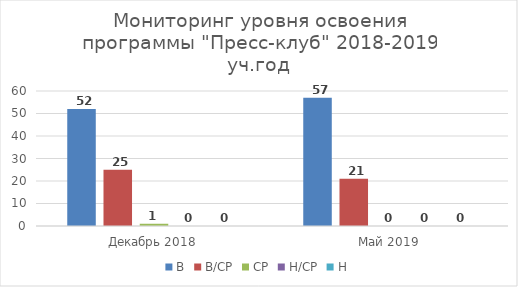
| Category | В | В/СР | СР | Н/СР | Н |
|---|---|---|---|---|---|
| Декабрь 2018 | 52 | 25 | 1 | 0 | 0 |
| Май 2019 | 57 | 21 | 0 | 0 | 0 |